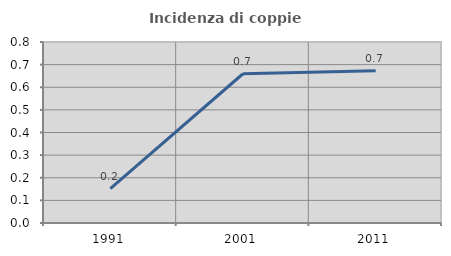
| Category | Incidenza di coppie miste |
|---|---|
| 1991.0 | 0.152 |
| 2001.0 | 0.66 |
| 2011.0 | 0.673 |